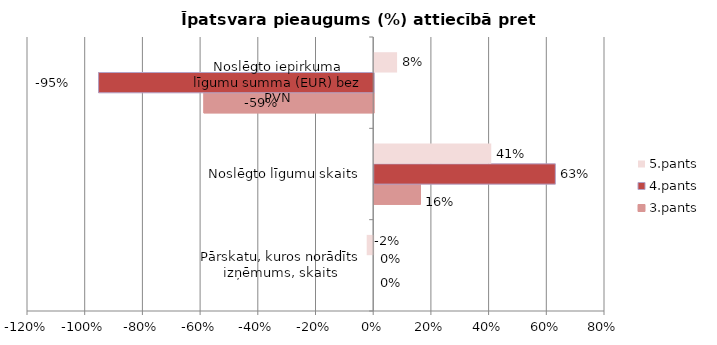
| Category | 3.pants | 4.pants | 5.pants |
|---|---|---|---|
| Pārskatu, kuros norādīts izņēmums, skaits | 0 | 0 | -0.022 |
| Noslēgto līgumu skaits | 0.16 | 0.628 | 0.406 |
| Noslēgto iepirkuma līgumu summa (EUR) bez PVN | -0.589 | -0.954 | 0.079 |